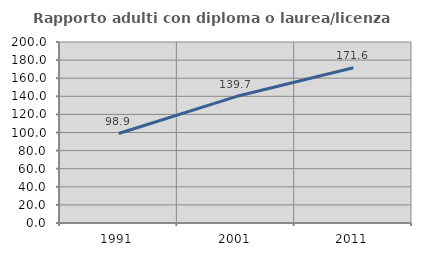
| Category | Rapporto adulti con diploma o laurea/licenza media  |
|---|---|
| 1991.0 | 98.895 |
| 2001.0 | 139.703 |
| 2011.0 | 171.611 |